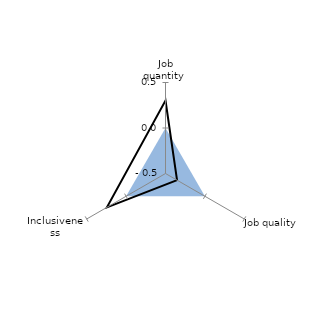
| Category | OECD average | Priority: quality |
|---|---|---|
| Job quantity  | 0 | 0.302 |
| Job quality  | 0 | -0.354 |
| Inclusiveness | 0 | 0.243 |